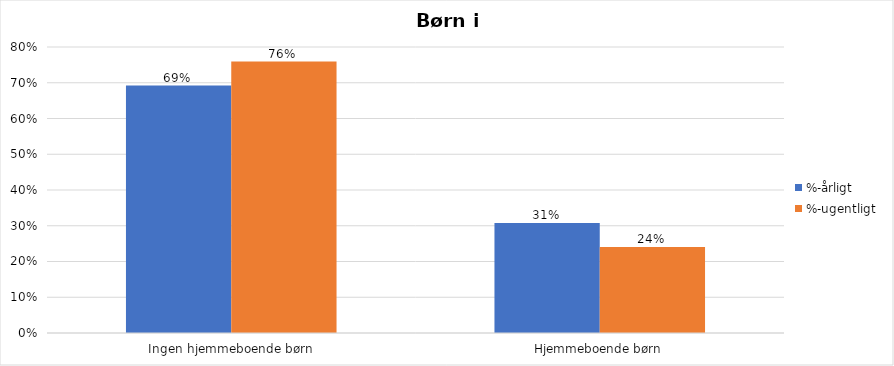
| Category | %-årligt | %-ugentligt |
|---|---|---|
| Ingen hjemmeboende børn | 0.692 | 0.759 |
| Hjemmeboende børn | 0.308 | 0.241 |